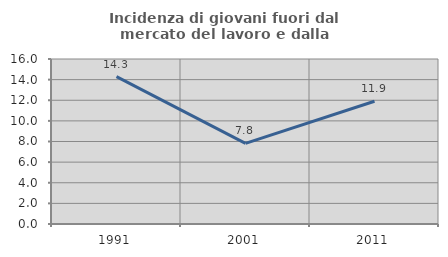
| Category | Incidenza di giovani fuori dal mercato del lavoro e dalla formazione  |
|---|---|
| 1991.0 | 14.286 |
| 2001.0 | 7.812 |
| 2011.0 | 11.905 |